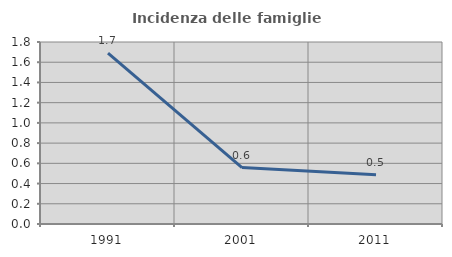
| Category | Incidenza delle famiglie numerose |
|---|---|
| 1991.0 | 1.69 |
| 2001.0 | 0.558 |
| 2011.0 | 0.487 |